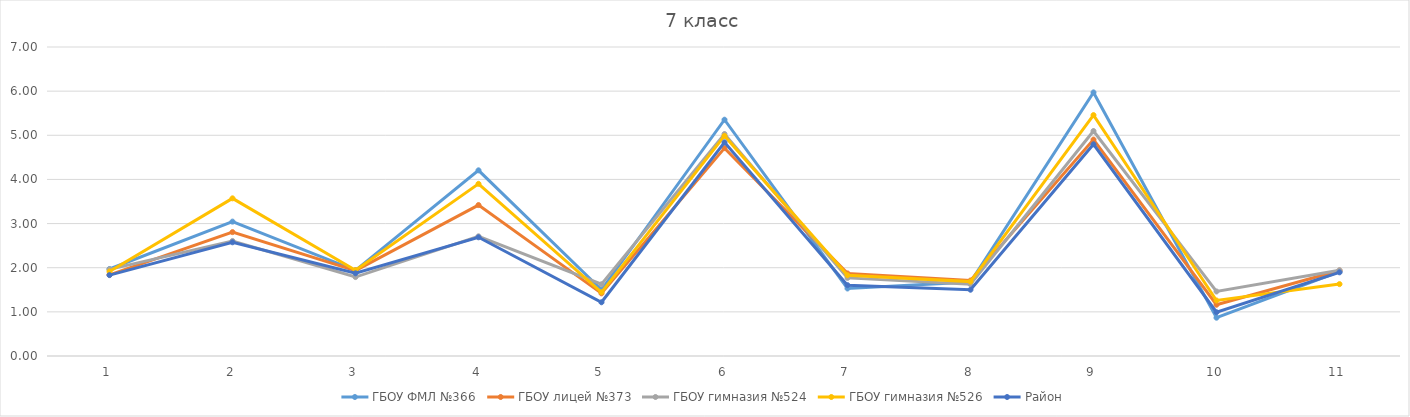
| Category | ГБОУ ФМЛ №366 | ГБОУ лицей №373 | ГБОУ гимназия №524 | ГБОУ гимназия №526 | Район |
|---|---|---|---|---|---|
| 0 | 1.971 | 1.839 | 1.962 | 1.914 | 1.833 |
| 1 | 3.044 | 2.806 | 2.606 | 3.571 | 2.576 |
| 2 | 1.941 | 1.935 | 1.788 | 1.943 | 1.873 |
| 3 | 4.206 | 3.419 | 2.712 | 3.9 | 2.689 |
| 4 | 1.5 | 1.419 | 1.625 | 1.443 | 1.218 |
| 5 | 5.353 | 4.71 | 5.029 | 4.986 | 4.84 |
| 6 | 1.529 | 1.871 | 1.769 | 1.829 | 1.604 |
| 7 | 1.676 | 1.71 | 1.625 | 1.686 | 1.502 |
| 8 | 5.971 | 4.903 | 5.096 | 5.457 | 4.796 |
| 9 | 0.868 | 1.161 | 1.462 | 1.257 | 0.991 |
| 10 | 1.912 | 1.935 | 1.942 | 1.629 | 1.895 |